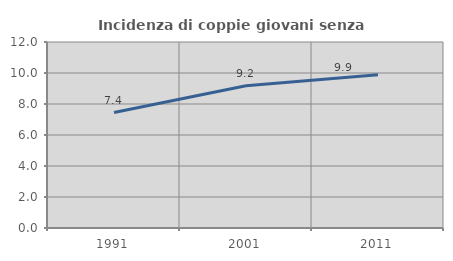
| Category | Incidenza di coppie giovani senza figli |
|---|---|
| 1991.0 | 7.447 |
| 2001.0 | 9.177 |
| 2011.0 | 9.888 |